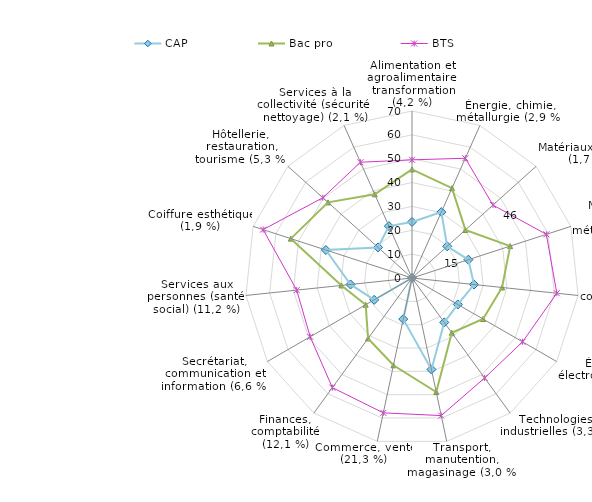
| Category | CAP | Bac pro | BTS |
|---|---|---|---|
| Alimentation et agroalimentaire, transformation (4,2 %) | 23.48 | 45.51 | 49.53 |
| Énergie, chimie, métallurgie (2,9 %) | 30.24 | 41.24 | 54.94 |
| Matériaux souples (1,7 %) | 19.85 | 30.12 | 45.68 |
| Mécanique et structures métalliques (9,9 %) | 24.85 | 43.26 | 59.22 |
| Génie civil, construction, bois (6,4 %) | 26.13 | 37.96 | 61.03 |
| Électricité, électronique (7,9 %) | 22.17 | 34.39 | 53.52 |
| Technologies industrielles (3,3 %) | 23 | 28.38 | 51.78 |
| Transport, manutention, magasinage (3,0 %) | 39.19 | 48.87 | 58.96 |
| Commerce, vente (21,3 %) | 17.62 | 37.41 | 57.79 |
| Finances, comptabilité (12,1 %) | 0 | 31.33 | 56.79 |
| Secrétariat, communication et information (6,6 %) | 18.29 | 22.42 | 49.28 |
| Services aux personnes (santé, social) (11,2 %) | 25.9 | 29.75 | 48.59 |
| Coiffure esthétique (1,9 %) | 37.96 | 53.39 | 65.62 |
| Hôtellerie, restauration, tourisme (5,3 %) | 19.16 | 47.37 | 50.29 |
| Services à la collectivité (sécurité, nettoyage) (2,1 %) | 23.8 | 38.41 | 53.11 |